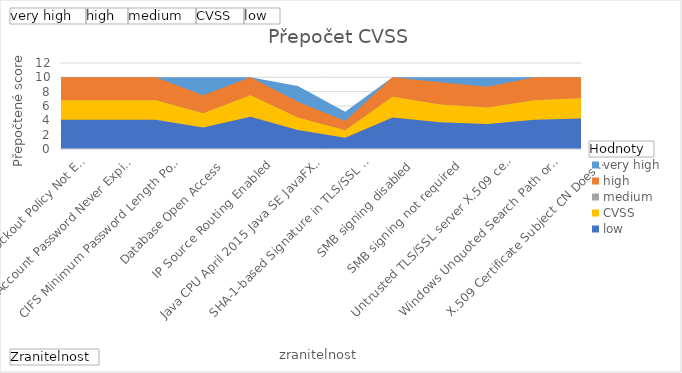
| Category | very high  | high  | medium  | CVSS  | low  |
|---|---|---|---|---|---|
| CIFS Account Lockout Policy Not Enforced | 10 | 10 | 6.8 | 6.8 | 4.08 |
| CIFS Account Password Never Expires | 10 | 10 | 6.8 | 6.8 | 4.08 |
| CIFS Minimum Password Length Policy Not Enforced | 10 | 10 | 6.8 | 6.8 | 4.08 |
| Database Open Access | 10 | 7.5 | 5 | 5 | 3 |
| IP Source Routing Enabled | 10 | 10 | 7.5 | 7.5 | 4.5 |
| Java CPU April 2015 Java SE JavaFX 2D vulnerability (CVE-2015-0459) | 8.8 | 6.6 | 4.4 | 4.4 | 2.64 |
| SHA-1-based Signature in TLS/SSL Server X.509 Certificate | 5.2 | 3.9 | 2.6 | 2.6 | 1.56 |
| SMB signing disabled | 10 | 10 | 7.3 | 7.3 | 4.38 |
| SMB signing not required | 10 | 9.3 | 6.2 | 6.2 | 3.72 |
| Untrusted TLS/SSL server X.509 certificate | 10 | 8.7 | 5.8 | 5.8 | 3.48 |
| Windows Unquoted Search Path or Element can allow local privilege escalation | 10 | 10 | 6.8 | 6.8 | 4.08 |
| X.509 Certificate Subject CN Does Not Match the Entity Name | 10 | 10 | 7.1 | 7.1 | 4.26 |